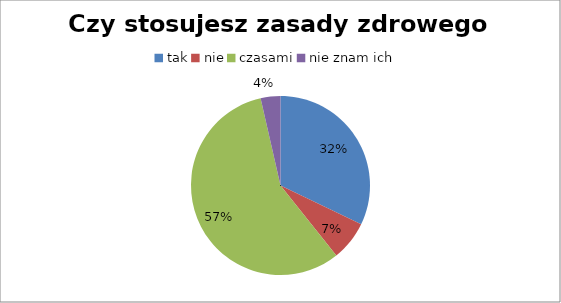
| Category | Czy stosujesz zasady zdrowego odżywiania? |
|---|---|
| tak | 9 |
| nie | 2 |
| czasami | 16 |
| nie znam ich | 1 |